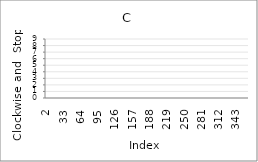
| Category | Series 0 |
|---|---|
| 2.0 | 7 |
| 3.0 | 3 |
| 4.0 | 0 |
| 5.0 | 0 |
| 6.0 | 8 |
| 7.0 | 3 |
| 8.0 | 6 |
| 9.0 | 9 |
| 10.0 | 2 |
| 11.0 | 2 |
| 12.0 | 7 |
| 13.0 | 8 |
| 14.0 | 4 |
| 15.0 | 7 |
| 16.0 | 5 |
| 17.0 | 4 |
| 18.0 | 9 |
| 19.0 | 4 |
| 20.0 | 0 |
| 21.0 | 6 |
| 22.0 | 9 |
| 23.0 | 3 |
| 24.0 | 3 |
| 25.0 | 8 |
| 26.0 | 1 |
| 27.0 | 3 |
| 28.0 | 6 |
| 29.0 | 6 |
| 30.0 | 5 |
| 31.0 | 99 |
| 32.0 | 99 |
| 33.0 | 99 |
| 34.0 | 99 |
| 35.0 | 99 |
| 36.0 | 99 |
| 37.0 | 99 |
| 38.0 | 99 |
| 39.0 | 99 |
| 40.0 | 99 |
| 41.0 | 99 |
| 42.0 | 99 |
| 43.0 | 99 |
| 44.0 | 99 |
| 45.0 | 99 |
| 46.0 | 99 |
| 47.0 | 99 |
| 48.0 | 99 |
| 49.0 | 99 |
| 50.0 | 99 |
| 51.0 | 99 |
| 52.0 | 99 |
| 53.0 | 99 |
| 54.0 | 99 |
| 55.0 | 99 |
| 56.0 | 99 |
| 57.0 | 99 |
| 58.0 | 99 |
| 59.0 | 99 |
| 60.0 | 99 |
| 61.0 | 99 |
| 62.0 | 99 |
| 63.0 | 99 |
| 64.0 | 99 |
| 65.0 | 99 |
| 66.0 | 99 |
| 67.0 | 99 |
| 68.0 | 99 |
| 69.0 | 99 |
| 70.0 | 99 |
| 71.0 | 99 |
| 72.0 | 99 |
| 73.0 | 99 |
| 74.0 | 99 |
| 75.0 | 99 |
| 76.0 | 99 |
| 77.0 | 99 |
| 78.0 | 99 |
| 79.0 | 99 |
| 80.0 | 99 |
| 81.0 | 99 |
| 82.0 | 99 |
| 83.0 | 99 |
| 84.0 | 99 |
| 85.0 | 99 |
| 86.0 | 99 |
| 87.0 | 99 |
| 88.0 | 99 |
| 89.0 | 99 |
| 90.0 | 99 |
| 91.0 | 99 |
| 92.0 | 99 |
| 93.0 | 99 |
| 94.0 | 99 |
| 95.0 | 99 |
| 96.0 | 99 |
| 97.0 | 99 |
| 98.0 | 99 |
| 99.0 | 99 |
| 100.0 | 99 |
| 101.0 | 99 |
| 102.0 | 99 |
| 103.0 | 99 |
| 104.0 | 99 |
| 105.0 | 99 |
| 106.0 | 99 |
| 107.0 | 99 |
| 108.0 | 99 |
| 109.0 | 99 |
| 110.0 | 99 |
| 111.0 | 99 |
| 112.0 | 99 |
| 113.0 | 99 |
| 114.0 | 99 |
| 115.0 | 99 |
| 116.0 | 99 |
| 117.0 | 99 |
| 118.0 | 99 |
| 119.0 | 99 |
| 120.0 | 99 |
| 121.0 | 99 |
| 122.0 | 99 |
| 123.0 | 99 |
| 124.0 | 99 |
| 125.0 | 99 |
| 126.0 | 99 |
| 127.0 | 99 |
| 128.0 | 99 |
| 129.0 | 99 |
| 130.0 | 99 |
| 131.0 | 99 |
| 132.0 | 99 |
| 133.0 | 99 |
| 134.0 | 99 |
| 135.0 | 99 |
| 136.0 | 99 |
| 137.0 | 99 |
| 138.0 | 99 |
| 139.0 | 99 |
| 140.0 | 99 |
| 141.0 | 99 |
| 142.0 | 99 |
| 143.0 | 99 |
| 144.0 | 99 |
| 145.0 | 99 |
| 146.0 | 99 |
| 147.0 | 99 |
| 148.0 | 99 |
| 149.0 | 99 |
| 150.0 | 99 |
| 151.0 | 99 |
| 152.0 | 99 |
| 153.0 | 99 |
| 154.0 | 99 |
| 155.0 | 99 |
| 156.0 | 99 |
| 157.0 | 99 |
| 158.0 | 99 |
| 159.0 | 99 |
| 160.0 | 99 |
| 161.0 | 99 |
| 162.0 | 99 |
| 163.0 | 99 |
| 164.0 | 99 |
| 165.0 | 99 |
| 166.0 | 99 |
| 167.0 | 99 |
| 168.0 | 99 |
| 169.0 | 99 |
| 170.0 | 99 |
| 171.0 | 99 |
| 172.0 | 99 |
| 173.0 | 99 |
| 174.0 | 99 |
| 175.0 | 99 |
| 176.0 | 99 |
| 177.0 | 99 |
| 178.0 | 99 |
| 179.0 | 99 |
| 180.0 | 99 |
| 181.0 | 99 |
| 182.0 | 99 |
| 183.0 | 99 |
| 184.0 | 99 |
| 185.0 | 99 |
| 186.0 | 99 |
| 187.0 | 99 |
| 188.0 | 99 |
| 189.0 | 99 |
| 190.0 | 99 |
| 191.0 | 99 |
| 192.0 | 99 |
| 193.0 | 99 |
| 194.0 | 99 |
| 195.0 | 99 |
| 196.0 | 99 |
| 197.0 | 99 |
| 198.0 | 99 |
| 199.0 | 99 |
| 200.0 | 99 |
| 201.0 | 99 |
| 202.0 | 99 |
| 203.0 | 99 |
| 204.0 | 99 |
| 205.0 | 99 |
| 206.0 | 99 |
| 207.0 | 99 |
| 208.0 | 99 |
| 209.0 | 99 |
| 210.0 | 99 |
| 211.0 | 99 |
| 212.0 | 99 |
| 213.0 | 99 |
| 214.0 | 99 |
| 215.0 | 99 |
| 216.0 | 99 |
| 217.0 | 99 |
| 218.0 | 99 |
| 219.0 | 99 |
| 220.0 | 99 |
| 221.0 | 99 |
| 222.0 | 99 |
| 223.0 | 99 |
| 224.0 | 99 |
| 225.0 | 99 |
| 226.0 | 99 |
| 227.0 | 99 |
| 228.0 | 99 |
| 229.0 | 99 |
| 230.0 | 99 |
| 231.0 | 99 |
| 232.0 | 99 |
| 233.0 | 99 |
| 234.0 | 99 |
| 235.0 | 99 |
| 236.0 | 99 |
| 237.0 | 99 |
| 238.0 | 99 |
| 239.0 | 99 |
| 240.0 | 99 |
| 241.0 | 99 |
| 242.0 | 99 |
| 243.0 | 99 |
| 244.0 | 99 |
| 245.0 | 99 |
| 246.0 | 99 |
| 247.0 | 99 |
| 248.0 | 99 |
| 249.0 | 99 |
| 250.0 | 99 |
| 251.0 | 99 |
| 252.0 | 99 |
| 253.0 | 99 |
| 254.0 | 99 |
| 255.0 | 99 |
| 256.0 | 99 |
| 257.0 | 99 |
| 258.0 | 99 |
| 259.0 | 99 |
| 260.0 | 99 |
| 261.0 | 99 |
| 262.0 | 99 |
| 263.0 | 99 |
| 264.0 | 99 |
| 265.0 | 99 |
| 266.0 | 99 |
| 267.0 | 99 |
| 268.0 | 99 |
| 269.0 | 99 |
| 270.0 | 99 |
| 271.0 | 99 |
| 272.0 | 99 |
| 273.0 | 99 |
| 274.0 | 99 |
| 275.0 | 99 |
| 276.0 | 99 |
| 277.0 | 99 |
| 278.0 | 99 |
| 279.0 | 99 |
| 280.0 | 99 |
| 281.0 | 99 |
| 282.0 | 99 |
| 283.0 | 99 |
| 284.0 | 99 |
| 285.0 | 99 |
| 286.0 | 99 |
| 287.0 | 99 |
| 288.0 | 99 |
| 289.0 | 99 |
| 290.0 | 99 |
| 291.0 | 99 |
| 292.0 | 99 |
| 293.0 | 99 |
| 294.0 | 99 |
| 295.0 | 99 |
| 296.0 | 99 |
| 297.0 | 99 |
| 298.0 | 99 |
| 299.0 | 99 |
| 300.0 | 99 |
| 301.0 | 99 |
| 302.0 | 99 |
| 303.0 | 99 |
| 304.0 | 99 |
| 305.0 | 99 |
| 306.0 | 99 |
| 307.0 | 99 |
| 308.0 | 99 |
| 309.0 | 99 |
| 310.0 | 99 |
| 311.0 | 99 |
| 312.0 | 99 |
| 313.0 | 99 |
| 314.0 | 99 |
| 315.0 | 99 |
| 316.0 | 99 |
| 317.0 | 99 |
| 318.0 | 99 |
| 319.0 | 99 |
| 320.0 | 99 |
| 321.0 | 99 |
| 322.0 | 99 |
| 323.0 | 99 |
| 324.0 | 99 |
| 325.0 | 99 |
| 326.0 | 99 |
| 327.0 | 99 |
| 328.0 | 99 |
| 329.0 | 99 |
| 330.0 | 99 |
| 331.0 | 99 |
| 332.0 | 99 |
| 333.0 | 99 |
| 334.0 | 99 |
| 335.0 | 99 |
| 336.0 | 99 |
| 337.0 | 99 |
| 338.0 | 99 |
| 339.0 | 99 |
| 340.0 | 99 |
| 341.0 | 99 |
| 342.0 | 99 |
| 343.0 | 99 |
| 344.0 | 99 |
| 345.0 | 99 |
| 346.0 | 99 |
| 347.0 | 99 |
| 348.0 | 99 |
| 349.0 | 99 |
| 350.0 | 99 |
| 351.0 | 99 |
| 352.0 | 99 |
| 353.0 | 99 |
| 354.0 | 99 |
| 355.0 | 99 |
| 356.0 | 99 |
| 357.0 | 99 |
| 358.0 | 99 |
| 359.0 | 99 |
| 360.0 | 99 |
| 361.0 | 99 |
| 362.0 | 99 |
| 363.0 | 99 |
| 364.0 | 99 |
| 365.0 | 99 |